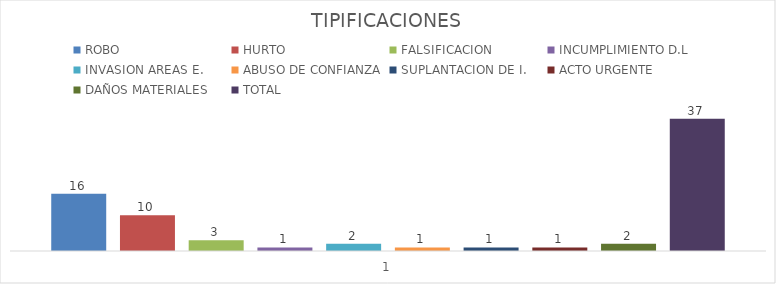
| Category | ROBO | HURTO | FALSIFICACION | INCUMPLIMIENTO D.L | INVASION AREAS E. | ABUSO DE CONFIANZA | SUPLANTACION DE I. | ACTO URGENTE | DAÑOS MATERIALES | TOTAL |
|---|---|---|---|---|---|---|---|---|---|---|
| 0 | 16 | 10 | 3 | 1 | 2 | 1 | 1 | 1 | 2 | 37 |